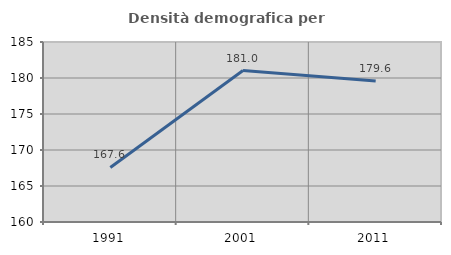
| Category | Densità demografica |
|---|---|
| 1991.0 | 167.58 |
| 2001.0 | 181.03 |
| 2011.0 | 179.576 |